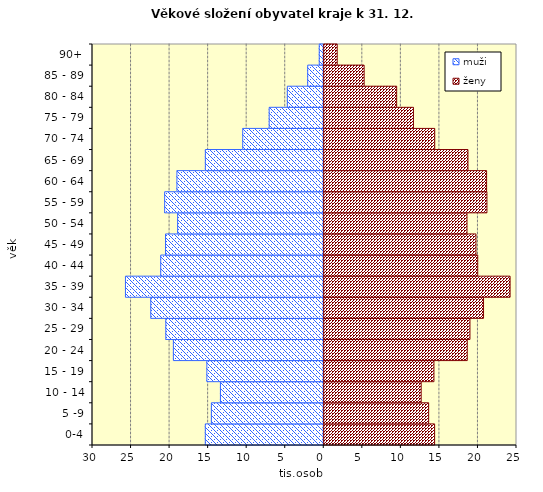
| Category | muži | ženy |
|---|---|---|
| 0-4 | -15368 | 14444 |
|  5 -9 | -14578 | 13670 |
|  10 - 14 | -13405 | 12698 |
| 15 - 19 | -15165 | 14356 |
| 20 - 24 | -19508 | 18673 |
| 25 - 29 | -20491 | 19027 |
| 30 - 34 | -22442 | 20789 |
| 35 - 39 | -25725 | 24235 |
| 40 - 44 | -21148 | 20036 |
| 45 - 49 | -20527 | 19807 |
| 50 - 54 | -18956 | 18642 |
| 55 - 59 | -20640 | 21230 |
| 60 - 64 | -19049 | 21187 |
| 65 - 69 | -15361 | 18769 |
| 70 - 74 | -10512 | 14458 |
| 75 - 79 | -7079 | 11696 |
| 80 - 84 | -4725 | 9521 |
| 85 - 89 | -2084 | 5300 |
| 90+ | -587 | 1805 |